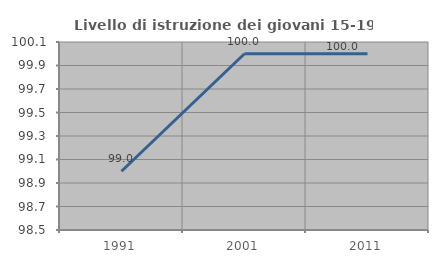
| Category | Livello di istruzione dei giovani 15-19 anni |
|---|---|
| 1991.0 | 99 |
| 2001.0 | 100 |
| 2011.0 | 100 |